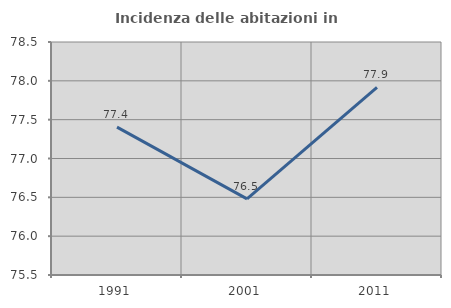
| Category | Incidenza delle abitazioni in proprietà  |
|---|---|
| 1991.0 | 77.405 |
| 2001.0 | 76.48 |
| 2011.0 | 77.915 |